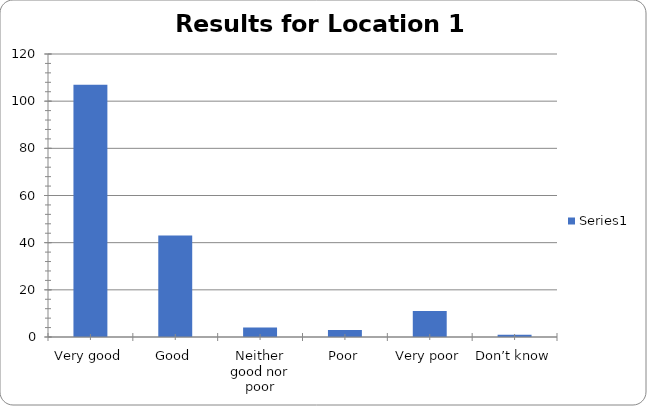
| Category | Series 0 |
|---|---|
| Very good | 107 |
| Good | 43 |
| Neither good nor poor | 4 |
| Poor | 3 |
| Very poor | 11 |
| Don’t know | 1 |